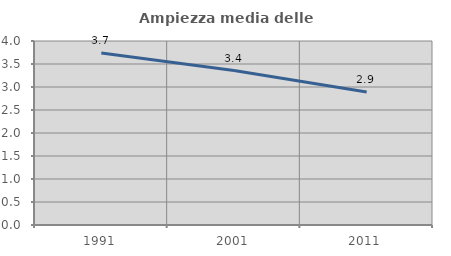
| Category | Ampiezza media delle famiglie |
|---|---|
| 1991.0 | 3.739 |
| 2001.0 | 3.359 |
| 2011.0 | 2.89 |